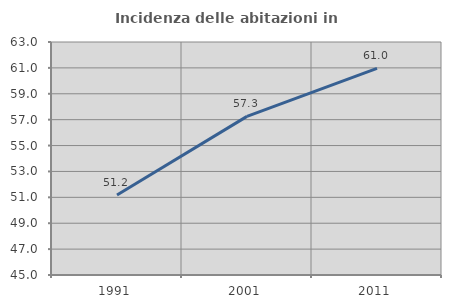
| Category | Incidenza delle abitazioni in proprietà  |
|---|---|
| 1991.0 | 51.179 |
| 2001.0 | 57.256 |
| 2011.0 | 60.961 |